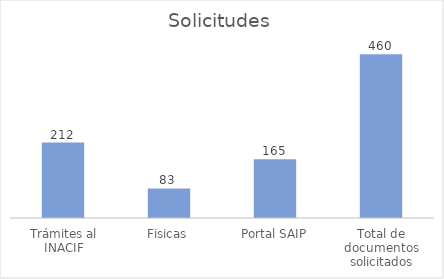
| Category | Series 0 |
|---|---|
| Trámites al INACIF | 212 |
| Fisicas | 83 |
| Portal SAIP | 165 |
| Total de documentos solicitados | 460 |